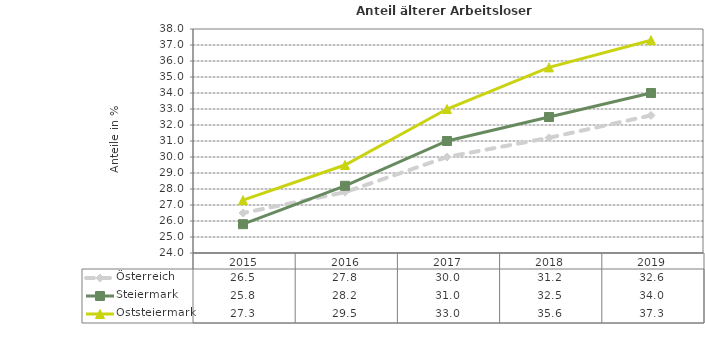
| Category | Österreich | Steiermark | Oststeiermark |
|---|---|---|---|
| 2019.0 | 32.6 | 34 | 37.3 |
| 2018.0 | 31.2 | 32.5 | 35.6 |
| 2017.0 | 30 | 31 | 33 |
| 2016.0 | 27.8 | 28.2 | 29.5 |
| 2015.0 | 26.5 | 25.8 | 27.3 |